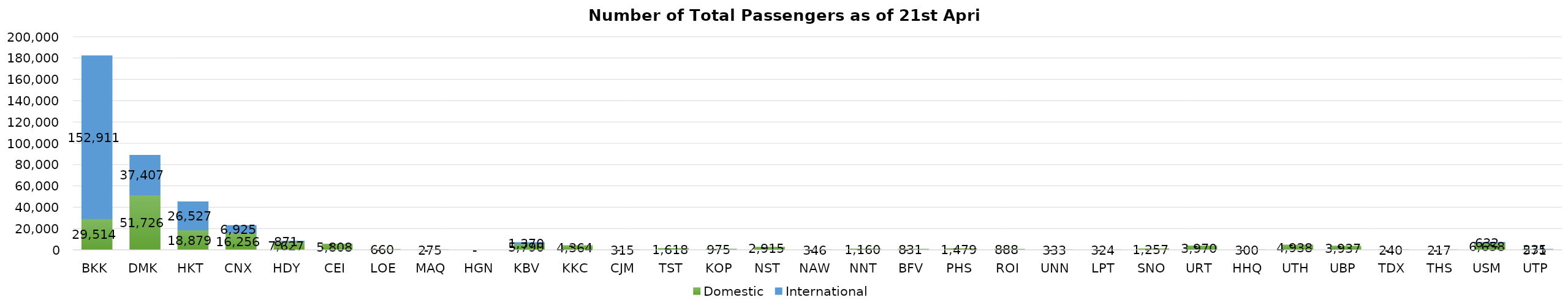
| Category | Domestic | International |
|---|---|---|
| BKK | 29514 | 152911 |
| DMK | 51726 | 37407 |
| HKT | 18879 | 26527 |
| CNX | 16256 | 6925 |
| HDY | 7627 | 871 |
| CEI | 5808 | 0 |
| LOE | 660 | 0 |
| MAQ | 275 | 0 |
| HGN | 0 | 0 |
| KBV | 5790 | 1370 |
| KKC | 4364 | 0 |
| CJM | 315 | 0 |
| TST | 1618 | 0 |
| KOP | 975 | 0 |
| NST | 2915 | 0 |
| NAW | 346 | 0 |
| NNT | 1160 | 0 |
| BFV | 831 | 0 |
| PHS | 1479 | 0 |
| ROI | 888 | 0 |
| UNN | 333 | 0 |
| LPT | 324 | 0 |
| SNO | 1257 | 0 |
| URT | 3970 | 0 |
| HHQ | 300 | 0 |
| UTH | 4938 | 0 |
| UBP | 3937 | 0 |
| TDX | 240 | 0 |
| THS | 217 | 0 |
| USM | 6658 | 632 |
| UTP | 571 | 235 |